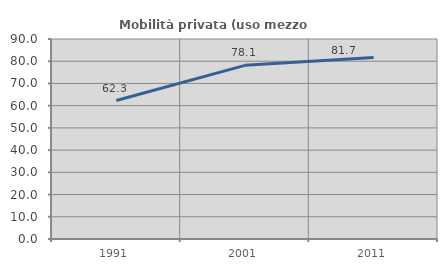
| Category | Mobilità privata (uso mezzo privato) |
|---|---|
| 1991.0 | 62.305 |
| 2001.0 | 78.148 |
| 2011.0 | 81.686 |